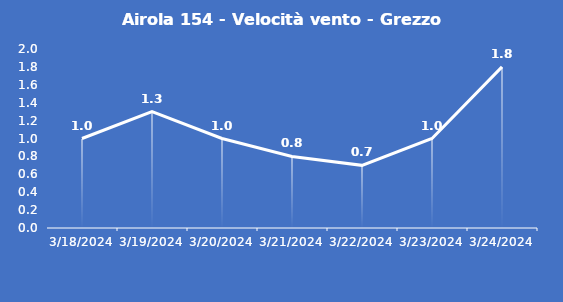
| Category | Airola 154 - Velocità vento - Grezzo (m/s) |
|---|---|
| 3/18/24 | 1 |
| 3/19/24 | 1.3 |
| 3/20/24 | 1 |
| 3/21/24 | 0.8 |
| 3/22/24 | 0.7 |
| 3/23/24 | 1 |
| 3/24/24 | 1.8 |